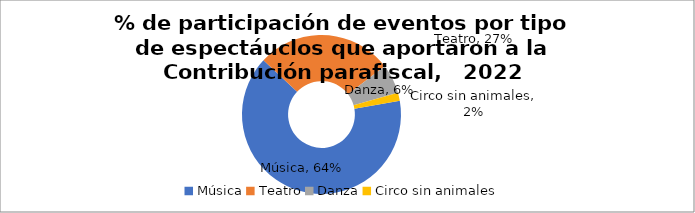
| Category | % año 2022 |
|---|---|
| Música | 0.64 |
| Teatro | 0.273 |
| Danza | 0.059 |
| Circo sin animales | 0.016 |